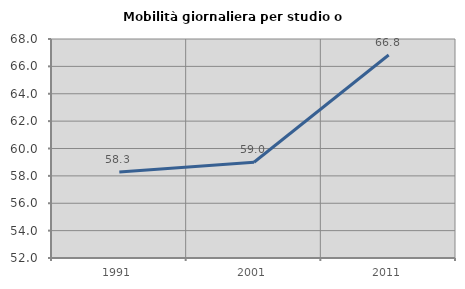
| Category | Mobilità giornaliera per studio o lavoro |
|---|---|
| 1991.0 | 58.275 |
| 2001.0 | 58.993 |
| 2011.0 | 66.829 |